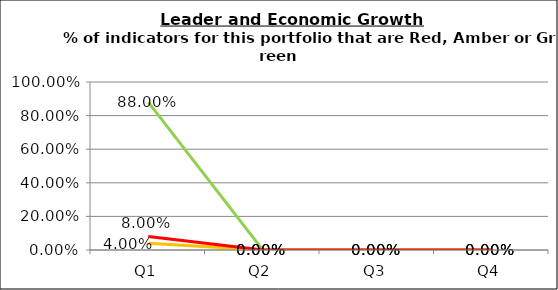
| Category | Green | Amber | Red |
|---|---|---|---|
| Q1 | 0.88 | 0.04 | 0.08 |
| Q2 | 0 | 0 | 0 |
| Q3 | 0 | 0 | 0 |
| Q4 | 0 | 0 | 0 |